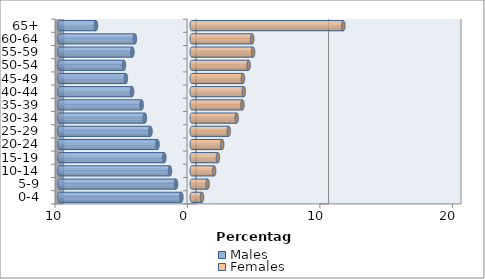
| Category | Males | Females |
|---|---|---|
| 0-4 | -0.786 | 0.77 |
| 5-9 | -1.187 | 1.197 |
| 10-14 | -1.646 | 1.688 |
| 15-19 | -2.077 | 1.975 |
| 20-24 | -2.588 | 2.297 |
| 25-29 | -3.118 | 2.79 |
| 30-34 | -3.542 | 3.393 |
| 35-39 | -3.782 | 3.823 |
| 40-44 | -4.508 | 3.928 |
| 45-49 | -4.977 | 3.864 |
| 50-54 | -5.12 | 4.293 |
| 55-59 | -4.483 | 4.629 |
| 60-64 | -4.296 | 4.567 |
| 65+ | -7.233 | 11.443 |